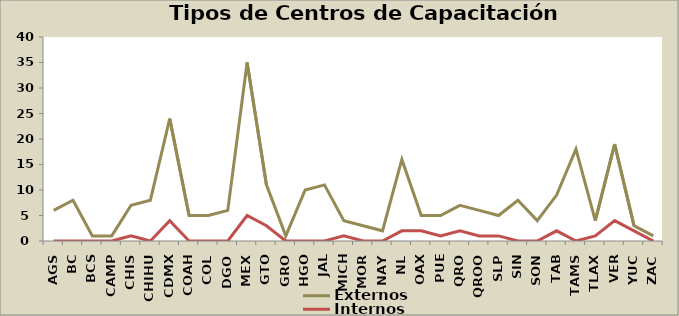
| Category | Externos | Internos |
|---|---|---|
| AGS | 6 | 0 |
| BC | 8 | 0 |
| BCS | 1 | 0 |
| CAMP | 1 | 0 |
| CHIS | 7 | 1 |
| CHIHU | 8 | 0 |
| CDMX | 24 | 4 |
| COAH | 5 | 0 |
| COL | 5 | 0 |
| DGO | 6 | 0 |
| MEX | 35 | 5 |
| GTO | 11 | 3 |
| GRO | 1 | 0 |
| HGO | 10 | 0 |
| JAL | 11 | 0 |
| MICH | 4 | 1 |
| MOR | 3 | 0 |
| NAY | 2 | 0 |
| NL | 16 | 2 |
| OAX | 5 | 2 |
| PUE | 5 | 1 |
| QRO | 7 | 2 |
| QROO | 6 | 1 |
| SLP | 5 | 1 |
| SIN | 8 | 0 |
| SON | 4 | 0 |
| TAB | 9 | 2 |
| TAMS | 18 | 0 |
| TLAX | 4 | 1 |
| VER | 19 | 4 |
| YUC | 3 | 2 |
| ZAC | 1 | 0 |